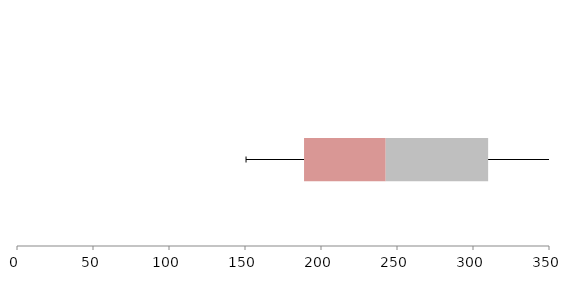
| Category | Series 1 | Series 2 | Series 3 |
|---|---|---|---|
| 0 | 188.842 | 53.732 | 67.385 |